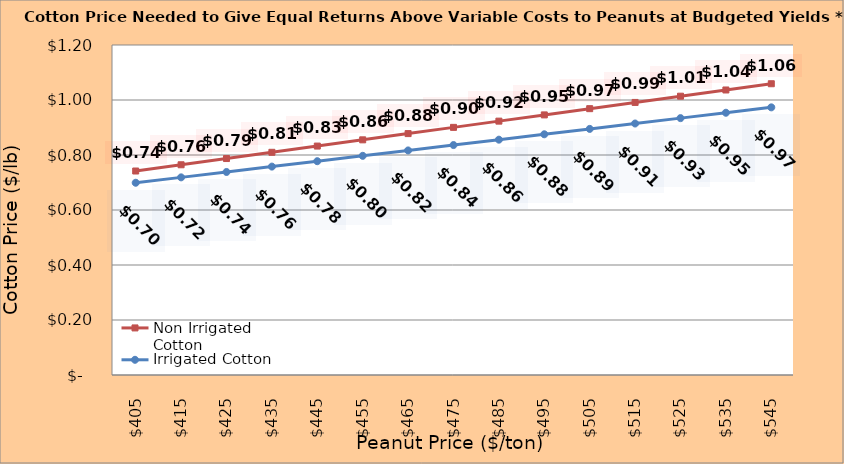
| Category | Non Irrigated Cotton | Irrigated Cotton |
|---|---|---|
| 405.0 | 0.742 | 0.699 |
| 415.0 | 0.764 | 0.719 |
| 425.0 | 0.787 | 0.738 |
| 435.0 | 0.81 | 0.758 |
| 445.0 | 0.832 | 0.777 |
| 455.0 | 0.855 | 0.797 |
| 465.0 | 0.878 | 0.817 |
| 475.0 | 0.9 | 0.836 |
| 485.0 | 0.923 | 0.856 |
| 495.0 | 0.946 | 0.875 |
| 505.0 | 0.968 | 0.895 |
| 515.0 | 0.991 | 0.915 |
| 525.0 | 1.014 | 0.934 |
| 535.0 | 1.036 | 0.954 |
| 545.0 | 1.059 | 0.973 |